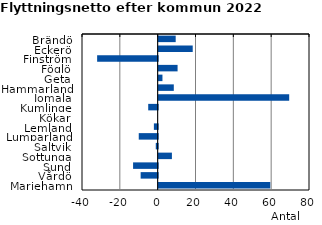
| Category | Series 0 |
|---|---|
| Brändö | 9 |
| Eckerö | 18 |
| Finström | -32 |
| Föglö | 10 |
| Geta | 2 |
| Hammarland | 8 |
| Jomala | 69 |
| Kumlinge | -5 |
| Kökar | 0 |
| Lemland | -2 |
| Lumparland | -10 |
| Saltvik | -1 |
| Sottunga | 7 |
| Sund | -13 |
| Vårdö | -9 |
| Mariehamn | 59 |